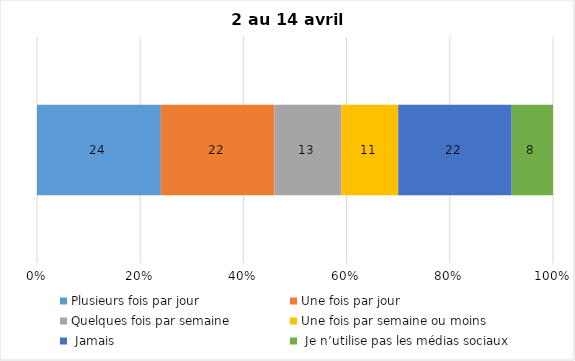
| Category | Plusieurs fois par jour | Une fois par jour | Quelques fois par semaine   | Une fois par semaine ou moins   |  Jamais   |  Je n’utilise pas les médias sociaux |
|---|---|---|---|---|---|---|
| 0 | 24 | 22 | 13 | 11 | 22 | 8 |